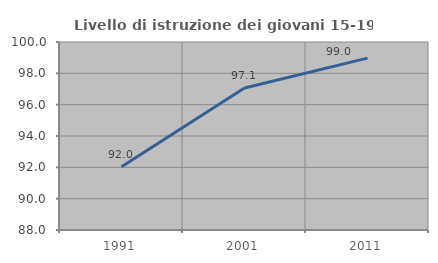
| Category | Livello di istruzione dei giovani 15-19 anni |
|---|---|
| 1991.0 | 92.04 |
| 2001.0 | 97.059 |
| 2011.0 | 98.969 |